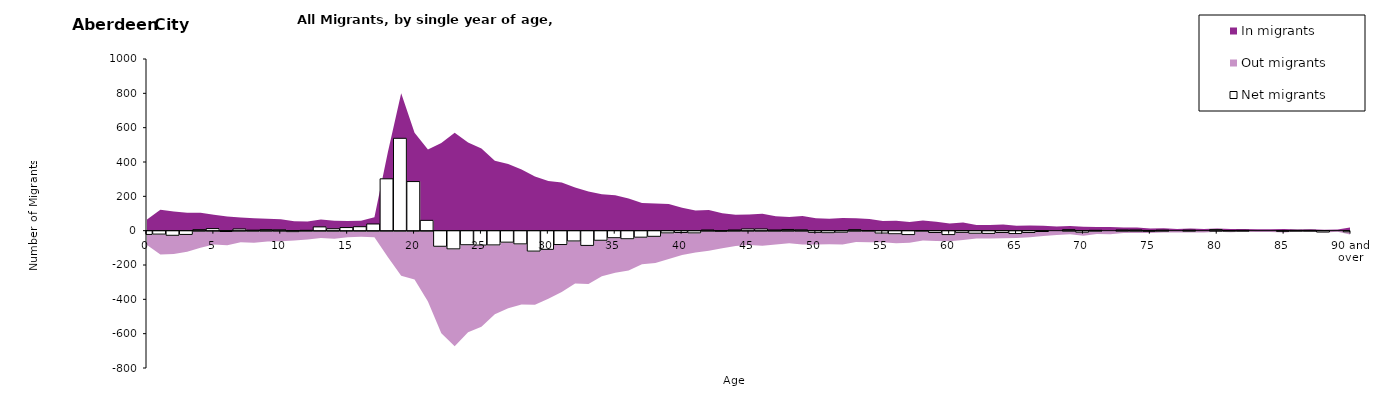
| Category |  Net migrants |
|---|---|
| 0 | -19 |
| 1 | -17 |
| 2 | -24 |
| 3 | -19 |
| 4 | 6 |
| 5 | 12 |
| 6 | -2 |
| 7 | 10 |
| 8 | 3 |
| 9 | 6 |
| 10 | 5 |
| 11 | -3 |
| 12 | 2 |
| 13 | 22 |
| 14 | 11 |
| 15 | 18 |
| 16 | 23 |
| 17 | 39 |
| 18 | 302 |
| 19 | 538 |
| 20 | 286 |
| 21 | 60 |
| 22 | -88 |
| 23 | -103 |
| 24 | -79 |
| 25 | -81 |
| 26 | -80 |
| 27 | -64 |
| 28 | -74 |
| 29 | -116 |
| 30 | -106 |
| 31 | -78 |
| 32 | -57 |
| 33 | -83 |
| 34 | -53 |
| 35 | -38 |
| 36 | -44 |
| 37 | -35 |
| 38 | -30 |
| 39 | -10 |
| 40 | -8 |
| 41 | -10 |
| 42 | 4 |
| 43 | -1 |
| 44 | 4 |
| 45 | 10 |
| 46 | 10 |
| 47 | 4 |
| 48 | 7 |
| 49 | 5 |
| 50 | -7 |
| 51 | -9 |
| 52 | -6 |
| 53 | 6 |
| 54 | 1 |
| 55 | -11 |
| 56 | -15 |
| 57 | -20 |
| 58 | 1 |
| 59 | -8 |
| 60 | -20 |
| 61 | -7 |
| 62 | -12 |
| 63 | -13 |
| 64 | -8 |
| 65 | -14 |
| 66 | -8 |
| 67 | -2 |
| 68 | 0 |
| 69 | 6 |
| 70 | -6 |
| 71 | 2 |
| 72 | 0 |
| 73 | 4 |
| 74 | 4 |
| 75 | -1 |
| 76 | 3 |
| 77 | 0 |
| 78 | 3 |
| 79 | 0 |
| 80 | 6 |
| 81 | 1 |
| 82 | 2 |
| 83 | 0 |
| 84 | 0 |
| 85 | -1 |
| 86 | 2 |
| 87 | 2 |
| 88 | -5 |
| 89 | 0 |
| 90 and over | -4 |